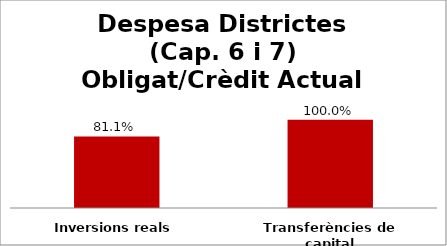
| Category | Series 0 |
|---|---|
| Inversions reals | 0.811 |
| Transferències de capital | 1 |